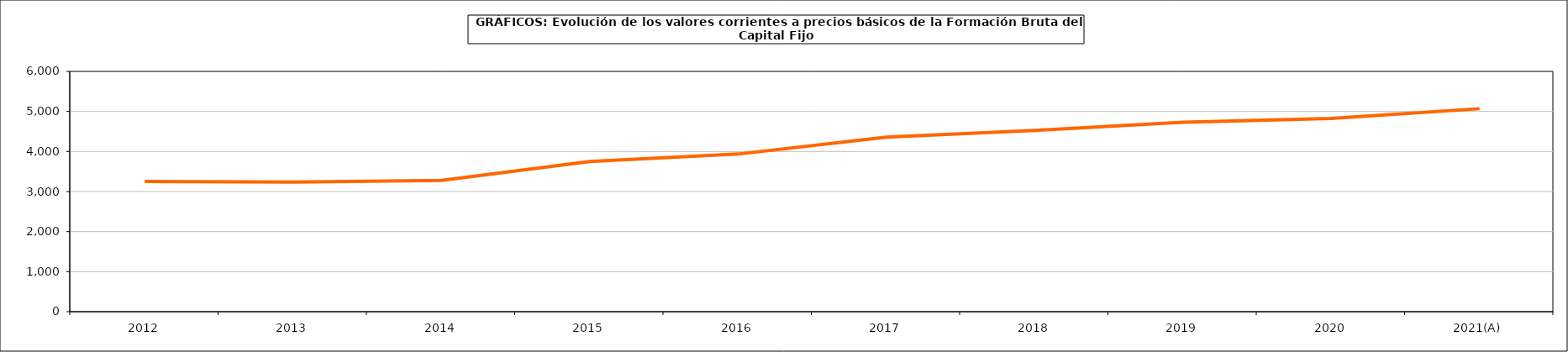
| Category | Formación bruta del capital fijo |
|---|---|
| 2012 | 3252.938 |
| 2013 | 3238.024 |
| 2014 | 3280.426 |
| 2015 | 3750.103 |
| 2016 | 3936.283 |
| 2017 | 4356.844 |
| 2018 | 4528.299 |
| 2019 | 4729.554 |
| 2020 | 4823.95 |
| 2021(A) | 5069.085 |